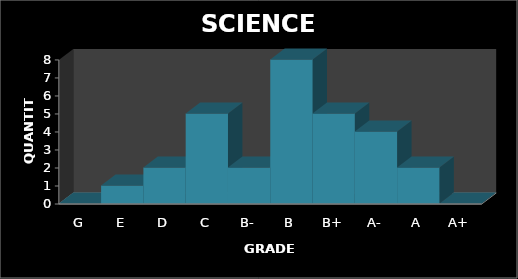
| Category | QUANTITY |
|---|---|
| G | 0 |
| E | 1 |
| D | 2 |
| C | 5 |
| B- | 2 |
| B | 8 |
| B+ | 5 |
| A- | 4 |
| A | 2 |
| A+ | 0 |